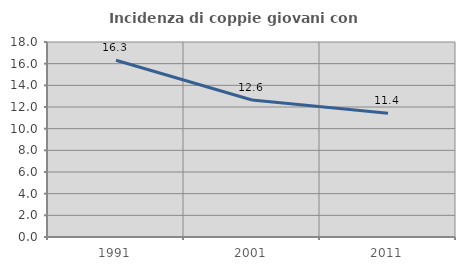
| Category | Incidenza di coppie giovani con figli |
|---|---|
| 1991.0 | 16.321 |
| 2001.0 | 12.644 |
| 2011.0 | 11.413 |